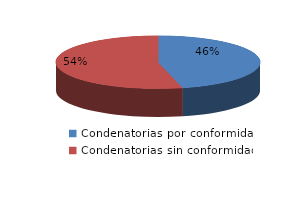
| Category | Series 0 |
|---|---|
| 0 | 30 |
| 1 | 35 |